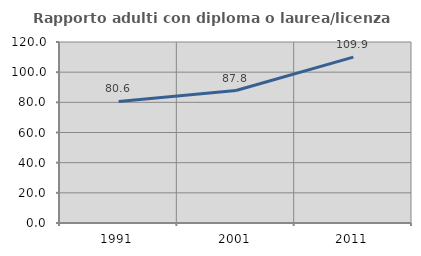
| Category | Rapporto adulti con diploma o laurea/licenza media  |
|---|---|
| 1991.0 | 80.62 |
| 2001.0 | 87.821 |
| 2011.0 | 109.942 |